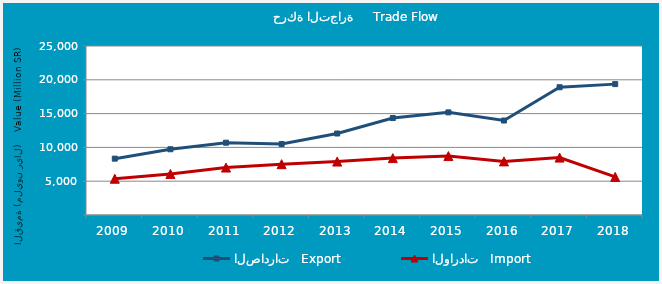
| Category | الصادرات   Export | الواردات   Import |
|---|---|---|
| 2009.0 | 8335999723 | 5364648878 |
| 2010.0 | 9725273788 | 6074346837 |
| 2011.0 | 10696326452 | 7021428900 |
| 2012.0 | 10498368354 | 7520003661 |
| 2013.0 | 12055552707 | 7909428723 |
| 2014.0 | 14344174823 | 8413949875 |
| 2015.0 | 15181185189 | 8719394321 |
| 2016.0 | 13974163121 | 7932570482 |
| 2017.0 | 18901709825 | 8492303585 |
| 2018.0 | 19360393780 | 5635124375 |